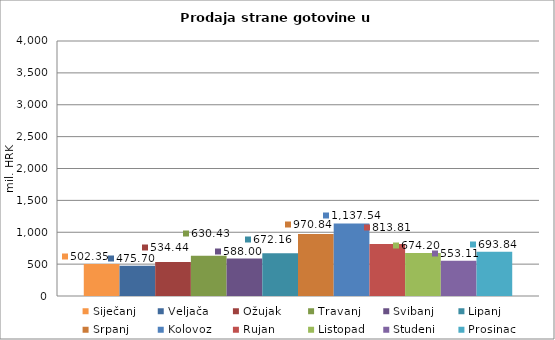
| Category | Siječanj | Veljača | Ožujak | Travanj | Svibanj | Lipanj | Srpanj | Kolovoz | Rujan | Listopad | Studeni | Prosinac |
|---|---|---|---|---|---|---|---|---|---|---|---|---|
| 0 | 502.354 | 475.695 | 534.436 | 630.432 | 588 | 672.157 | 970.84 | 1137.538 | 813.812 | 674.202 | 553.109 | 693.84 |